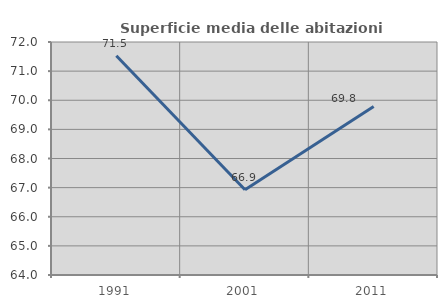
| Category | Superficie media delle abitazioni occupate |
|---|---|
| 1991.0 | 71.528 |
| 2001.0 | 66.926 |
| 2011.0 | 69.785 |